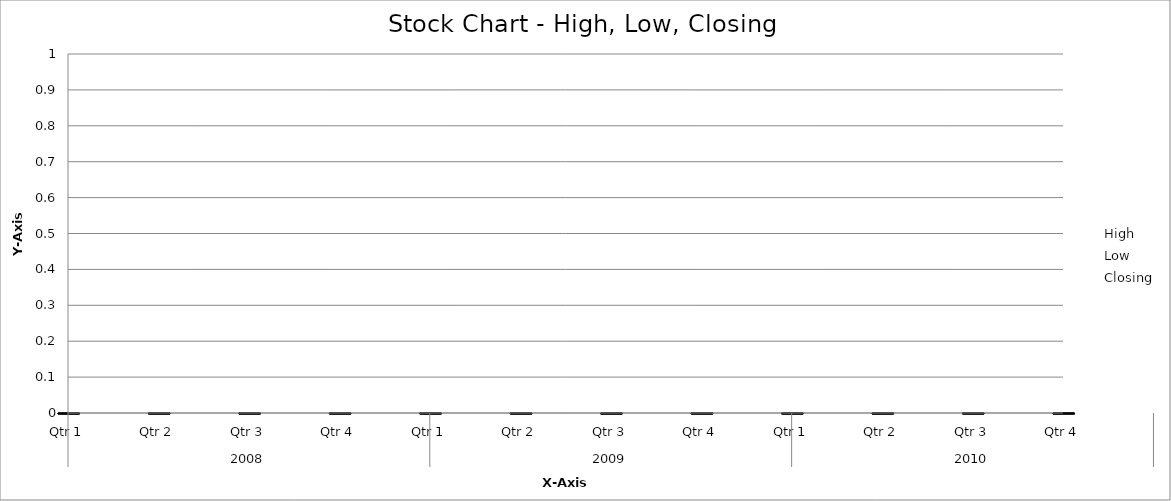
| Category | High | Low | Closing |
|---|---|---|---|
| 0 | 175 | 95 | 111 |
| 1 | 159 | 72 | 144 |
| 2 | 190 | 117 | 137 |
| 3 | 179 | 103 | 127 |
| 4 | 184 | 98 | 165 |
| 5 | 282 | 141 | 220 |
| 6 | 298 | 194 | 291 |
| 7 | 349 | 255 | 325 |
| 8 | 418 | 291 | 330 |
| 9 | 396 | 297 | 391 |
| 10 | 463 | 343 | 406 |
| 11 | 485 | 376 | 392 |